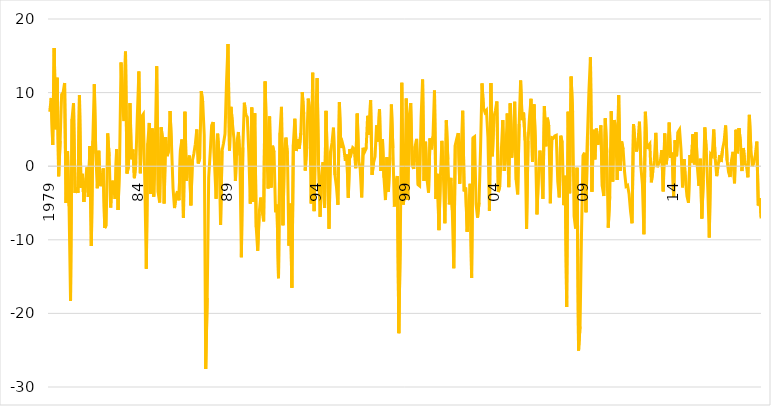
| Category | Series 0 | Series 1 | Series 2 | Series 3 |
|---|---|---|---|---|
| 1979 |  |  |  | 7.401 |
|  |  |  |  | 9.275 |
|  |  |  |  | 2.882 |
|  |  |  |  | 16.055 |
|  |  |  |  | 5.03 |
|  |  |  |  | 12.024 |
|  |  |  |  | -1.361 |
|  |  |  |  | 3.444 |
|  |  |  |  | 9.751 |
|  |  |  |  | 10.009 |
|  |  |  |  | 11.31 |
|  |  |  |  | -5.007 |
| 80 |  |  |  | 2.035 |
|  |  |  |  | -5.426 |
|  |  |  |  | -18.271 |
|  |  |  |  | 6.415 |
|  |  |  |  | 8.553 |
|  |  |  |  | -3.624 |
|  |  |  |  | -2.843 |
|  |  |  |  | -3.618 |
|  |  |  |  | 9.651 |
|  |  |  |  | -2.931 |
|  |  |  |  | -1.039 |
|  |  |  |  | -4.858 |
| 81 |  |  |  | -2.235 |
|  |  |  |  | -0.163 |
|  |  |  |  | -4.185 |
|  |  |  |  | 2.75 |
|  |  |  |  | -10.845 |
|  |  |  |  | 3.461 |
|  |  |  |  | 11.135 |
|  |  |  |  | 1.698 |
|  |  |  |  | -2.993 |
|  |  |  |  | 2.094 |
|  |  |  |  | -2.707 |
|  |  |  |  | -1.941 |
| 82 |  |  |  | -0.296 |
|  |  |  |  | -8.4 |
|  |  |  |  | -8.01 |
|  |  |  |  | 4.452 |
|  |  |  |  | 1.356 |
|  |  |  |  | -5.62 |
|  |  |  |  | -1.97 |
|  |  |  |  | -2.866 |
|  |  |  |  | -4.447 |
|  |  |  |  | 2.281 |
|  |  |  |  | -5.944 |
|  |  |  |  | 0.392 |
| 83 |  |  |  | 14.094 |
|  |  |  |  | 8.149 |
|  |  |  |  | 6.135 |
|  |  |  |  | 15.569 |
|  |  |  |  | -0.988 |
|  |  |  |  | -0.08 |
|  |  |  |  | 8.57 |
|  |  |  |  | 0.946 |
|  |  |  |  | 2.262 |
|  |  |  |  | -1.625 |
|  |  |  |  | 0.609 |
|  |  |  |  | 7.045 |
| 84 |  |  |  | 12.861 |
|  |  |  |  | -0.962 |
|  |  |  |  | 6.788 |
|  |  |  |  | 7.078 |
|  |  |  |  | -2.181 |
|  |  |  |  | -13.929 |
|  |  |  |  | 3.132 |
|  |  |  |  | 5.882 |
|  |  |  |  | -3.789 |
|  |  |  |  | 5.116 |
|  |  |  |  | -4.134 |
|  |  |  |  | 2.238 |
| 85 |  |  |  | 13.593 |
|  |  |  |  | -3.578 |
|  |  |  |  | -4.921 |
|  |  |  |  | 5.283 |
|  |  |  |  | 3.603 |
|  |  |  |  | -5.073 |
|  |  |  |  | 3.952 |
|  |  |  |  | 1.368 |
|  |  |  |  | 2.074 |
|  |  |  |  | 7.507 |
|  |  |  |  | 2.786 |
|  |  |  |  | -2.994 |
| 86 |  |  |  | -5.684 |
|  |  |  |  | -3.966 |
|  |  |  |  | -3.404 |
|  |  |  |  | -4.629 |
|  |  |  |  | 2.242 |
|  |  |  |  | 3.621 |
|  |  |  |  | -7.017 |
|  |  |  |  | 7.397 |
|  |  |  |  | -1.993 |
|  |  |  |  | 0.742 |
|  |  |  |  | 1.45 |
|  |  |  |  | -5.327 |
| 87 |  |  |  | 0.75 |
|  |  |  |  | 1.678 |
|  |  |  |  | 2.993 |
|  |  |  |  | 4.988 |
|  |  |  |  | 0.372 |
|  |  |  |  | 1.11 |
|  |  |  |  | 10.201 |
|  |  |  |  | 8.688 |
|  |  |  |  | 4.24 |
|  |  |  |  | -27.561 |
|  |  |  |  | -17.905 |
|  |  |  |  | -1.566 |
| 88 |  |  |  | 1.784 |
|  |  |  |  | 5.55 |
|  |  |  |  | 6.004 |
|  |  |  |  | 0.084 |
|  |  |  |  | -4.416 |
|  |  |  |  | 4.417 |
|  |  |  |  | 1.658 |
|  |  |  |  | -7.969 |
|  |  |  |  | 2.101 |
|  |  |  |  | 3.111 |
|  |  |  |  | 4.4 |
|  |  |  |  | 11.4 |
| 89 |  |  |  | 16.609 |
|  |  |  |  | 2.142 |
|  |  |  |  | 8.063 |
|  |  |  |  | 5.774 |
|  |  |  |  | 3.743 |
|  |  |  |  | -2.018 |
|  |  |  |  | 3.244 |
|  |  |  |  | 4.645 |
|  |  |  |  | 1.474 |
|  |  |  |  | -12.369 |
|  |  |  |  | 2.534 |
|  |  |  |  | 8.626 |
| 90 |  |  |  | 6.982 |
|  |  |  |  | 6.66 |
|  |  |  |  | 1.872 |
|  |  |  |  | -5.082 |
|  |  |  |  | 7.978 |
|  |  |  |  | -4.824 |
|  |  |  |  | 7.197 |
|  |  |  |  | -8.295 |
|  |  |  |  | -11.485 |
|  |  |  |  | -6.453 |
|  |  |  |  | -4.265 |
|  |  |  |  | -6.087 |
| 91 |  |  |  | -7.495 |
|  |  |  |  | 11.514 |
|  |  |  |  | 3.031 |
|  |  |  |  | -3.022 |
|  |  |  |  | 6.747 |
|  |  |  |  | -2.904 |
|  |  |  |  | 2.776 |
|  |  |  |  | 1.904 |
|  |  |  |  | -6.265 |
|  |  |  |  | -5.223 |
|  |  |  |  | -15.211 |
|  |  |  |  | 4.551 |
| 92 |  |  |  | 8.059 |
|  |  |  |  | -8.031 |
|  |  |  |  | 2.261 |
|  |  |  |  | 3.883 |
|  |  |  |  | 1.689 |
|  |  |  |  | -10.793 |
|  |  |  |  | -5.082 |
|  |  |  |  | -16.511 |
|  |  |  |  | 2.959 |
|  |  |  |  | 6.444 |
|  |  |  |  | 2.061 |
|  |  |  |  | 3.672 |
| 93 |  |  |  | 2.374 |
|  |  |  |  | 4.478 |
|  |  |  |  | 10.072 |
|  |  |  |  | 7.098 |
|  |  |  |  | -0.593 |
|  |  |  |  | 2.588 |
|  |  |  |  | 9.179 |
|  |  |  |  | 7.651 |
|  |  |  |  | -5.056 |
|  |  |  |  | 12.694 |
|  |  |  |  | -6.104 |
|  |  |  |  | 6.507 |
| 94 |  |  |  | 11.964 |
|  |  |  |  | -0.325 |
|  |  |  |  | -6.869 |
|  |  |  |  | -1.241 |
|  |  |  |  | 0.552 |
|  |  |  |  | -5.689 |
|  |  |  |  | 7.519 |
|  |  |  |  | -0.741 |
|  |  |  |  | -8.488 |
|  |  |  |  | 1.931 |
|  |  |  |  | 3.158 |
|  |  |  |  | 5.228 |
| 95 |  |  |  | -1.189 |
|  |  |  |  | -2.756 |
|  |  |  |  | -5.247 |
|  |  |  |  | 8.685 |
|  |  |  |  | 2.488 |
|  |  |  |  | 3.199 |
|  |  |  |  | 2.433 |
|  |  |  |  | 0.717 |
|  |  |  |  | 1.592 |
|  |  |  |  | -4.288 |
|  |  |  |  | 2.322 |
|  |  |  |  | 1.731 |
| 96 |  |  |  | 2.524 |
|  |  |  |  | 2.326 |
|  |  |  |  | -0.27 |
|  |  |  |  | 7.149 |
|  |  |  |  | 0.74 |
|  |  |  |  | -0.333 |
|  |  |  |  | -4.239 |
|  |  |  |  | 2.494 |
|  |  |  |  | 1.962 |
|  |  |  |  | 2.395 |
|  |  |  |  | 6.843 |
|  |  |  |  | 4.27 |
| 97 |  |  |  | 8.978 |
|  |  |  |  | -1.174 |
|  |  |  |  | 0.478 |
|  |  |  |  | 1.307 |
|  |  |  |  | 5.551 |
|  |  |  |  | 3.348 |
|  |  |  |  | 7.754 |
|  |  |  |  | -0.64 |
|  |  |  |  | 3.686 |
|  |  |  |  | -1.554 |
|  |  |  |  | -4.596 |
|  |  |  |  | 1.222 |
| 98 |  |  |  | -3.457 |
|  |  |  |  | 1.199 |
|  |  |  |  | 8.39 |
|  |  |  |  | 2.46 |
|  |  |  |  | -5.472 |
|  |  |  |  | -2.11 |
|  |  |  |  | -1.339 |
|  |  |  |  | -22.682 |
|  |  |  |  | -10.047 |
|  |  |  |  | 11.341 |
|  |  |  |  | -5.202 |
|  |  |  |  | -3.447 |
| 99 |  |  |  | 9.201 |
|  |  |  |  | -4.604 |
|  |  |  |  | 6.787 |
|  |  |  |  | 8.573 |
|  |  |  |  | 0.09 |
|  |  |  |  | -0.37 |
|  |  |  |  | 2.73 |
|  |  |  |  | 3.708 |
|  |  |  |  | -2.509 |
|  |  |  |  | -2.672 |
|  |  |  |  | 6.541 |
|  |  |  |  | 11.774 |
| 2000 |  |  |  | -2.011 |
|  |  |  |  | 3.324 |
|  |  |  |  | -1.809 |
|  |  |  |  | -3.592 |
|  |  |  |  | 3.773 |
|  |  |  |  | 2.295 |
|  |  |  |  | 4.063 |
|  |  |  |  | 10.277 |
|  |  |  |  | -4.45 |
|  |  |  |  | -1.038 |
|  |  |  |  | -8.684 |
|  |  |  |  | -1.424 |
| 01 |  |  |  | 3.44 |
|  |  |  |  | -1.249 |
|  |  |  |  | -7.743 |
|  |  |  |  | 6.23 |
|  |  |  |  | 0.897 |
|  |  |  |  | -5.187 |
|  |  |  |  | -1.587 |
|  |  |  |  | -5.962 |
|  |  |  |  | -13.863 |
|  |  |  |  | 2.841 |
|  |  |  |  | 3.742 |
|  |  |  |  | 4.497 |
| 02 |  |  |  | -2.369 |
|  |  |  |  | 2.075 |
|  |  |  |  | 7.542 |
|  |  |  |  | -3.419 |
|  |  |  |  | -2.887 |
|  |  |  |  | -8.916 |
|  |  |  |  | -6.29 |
|  |  |  |  | -2.398 |
|  |  |  |  | -15.182 |
|  |  |  |  | 3.877 |
|  |  |  |  | 4.026 |
|  |  |  |  | -5.133 |
| 03 |  |  |  | -6.996 |
|  |  |  |  | -4.96 |
|  |  |  |  | 2.197 |
|  |  |  |  | 11.245 |
|  |  |  |  | 7.934 |
|  |  |  |  | 7.325 |
|  |  |  |  | 7.592 |
|  |  |  |  | 3.917 |
|  |  |  |  | -6.097 |
|  |  |  |  | 11.289 |
|  |  |  |  | 1.343 |
|  |  |  |  | 6.675 |
| 04 |  |  |  | 7.531 |
|  |  |  |  | 8.795 |
|  |  |  |  | -3.514 |
|  |  |  |  | -2.707 |
|  |  |  |  | 2.069 |
|  |  |  |  | 6.261 |
|  |  |  |  | -0.644 |
|  |  |  |  | 1.621 |
|  |  |  |  | 7.168 |
|  |  |  |  | -2.84 |
|  |  |  |  | 8.533 |
|  |  |  |  | 1.181 |
| 05 |  |  |  | 3.483 |
|  |  |  |  | 8.751 |
|  |  |  |  | -1.874 |
|  |  |  |  | -3.829 |
|  |  |  |  | 5.738 |
|  |  |  |  | 11.636 |
|  |  |  |  | 6.26 |
|  |  |  |  | 7.29 |
|  |  |  |  | 3.514 |
|  |  |  |  | -8.512 |
|  |  |  |  | 3.438 |
|  |  |  |  | 6.74 |
| 06 |  |  |  | 9.155 |
|  |  |  |  | 0.602 |
|  |  |  |  | 8.399 |
|  |  |  |  | 2.958 |
|  |  |  |  | -6.546 |
|  |  |  |  | -1.198 |
|  |  |  |  | 2.11 |
|  |  |  |  | -0.191 |
|  |  |  |  | -4.438 |
|  |  |  |  | 8.165 |
|  |  |  |  | 2.707 |
|  |  |  |  | 6.587 |
| 07 |  |  |  | 5.421 |
|  |  |  |  | -5.036 |
|  |  |  |  | 3.875 |
|  |  |  |  | 3.801 |
|  |  |  |  | 4.103 |
|  |  |  |  | 4.2 |
|  |  |  |  | -2.068 |
|  |  |  |  | -4.236 |
|  |  |  |  | 4.131 |
|  |  |  |  | 3.207 |
|  |  |  |  | -5.291 |
|  |  |  |  | -1.29 |
| 08 |  |  |  | -19.135 |
|  |  |  |  | 7.392 |
|  |  |  |  | -3.664 |
|  |  |  |  | 12.178 |
|  |  |  |  | 7.307 |
|  |  |  |  | -6.779 |
|  |  |  |  | -8.46 |
|  |  |  |  | -0.219 |
|  |  |  |  | -25.042 |
|  |  |  |  | -21.78 |
|  |  |  |  | -9.046 |
|  |  |  |  | 1.451 |
| 09 |  |  |  | 1.83 |
|  |  |  |  | -6.267 |
|  |  |  |  | 4.025 |
|  |  |  |  | 10.298 |
|  |  |  |  | 14.791 |
|  |  |  |  | -3.46 |
|  |  |  |  | 4.942 |
|  |  |  |  | 0.93 |
|  |  |  |  | 5.112 |
|  |  |  |  | 2.91 |
|  |  |  |  | 3.839 |
|  |  |  |  | 5.545 |
| 10 |  |  |  | -2.766 |
|  |  |  |  | -4.055 |
|  |  |  |  | 6.507 |
|  |  |  |  | 1.867 |
|  |  |  |  | -8.347 |
|  |  |  |  | -4.104 |
|  |  |  |  | 7.474 |
|  |  |  |  | -2.086 |
|  |  |  |  | 6.264 |
|  |  |  |  | 5.289 |
|  |  |  |  | -1.867 |
|  |  |  |  | 9.645 |
| 11 |  |  |  | -0.619 |
|  |  |  |  | 3.368 |
|  |  |  |  | 2.294 |
|  |  |  |  | -0.825 |
|  |  |  |  | -2.74 |
|  |  |  |  | -2.592 |
|  |  |  |  | -3.772 |
|  |  |  |  | -6.147 |
|  |  |  |  | -7.752 |
|  |  |  |  | 5.732 |
|  |  |  |  | 3.195 |
|  |  |  |  | 1.992 |
| 12 |  |  |  | 3.265 |
|  |  |  |  | 6.05 |
|  |  |  |  | -0.168 |
|  |  |  |  | -2.509 |
|  |  |  |  | -9.255 |
|  |  |  |  | 7.386 |
|  |  |  |  | 2.37 |
|  |  |  |  | 2.757 |
|  |  |  |  | 3.033 |
|  |  |  |  | -2.193 |
|  |  |  |  | -0.67 |
|  |  |  |  | 0.824 |
| 13 |  |  |  | 4.521 |
|  |  |  |  | -0.133 |
|  |  |  |  | 0.485 |
|  |  |  |  | 0.6 |
|  |  |  |  | 2.182 |
|  |  |  |  | -3.422 |
|  |  |  |  | 4.441 |
|  |  |  |  | 0.268 |
|  |  |  |  | 1.87 |
|  |  |  |  | 5.929 |
|  |  |  |  | 1.131 |
|  |  |  |  | 1.845 |
| 14 |  |  |  | -4.108 |
|  |  |  |  | 3.535 |
|  |  |  |  | 1.349 |
|  |  |  |  | 4.645 |
|  |  |  |  | 4.98 |
|  |  |  |  | 2.189 |
|  |  |  |  | -2.879 |
|  |  |  |  | 0.964 |
|  |  |  |  | -1.87 |
|  |  |  |  | -4.09 |
|  |  |  |  | -4.963 |
|  |  |  |  | 1.515 |
| 15 |  |  |  | 0.496 |
|  |  |  |  | 4.337 |
|  |  |  |  | 0.253 |
|  |  |  |  | 4.611 |
|  |  |  |  | -0.132 |
|  |  |  |  | -2.663 |
|  |  |  |  | 1.012 |
|  |  |  |  | -7.109 |
|  |  |  |  | -1.853 |
|  |  |  |  | 5.269 |
|  |  |  |  | 2.156 |
|  |  |  |  | -3.091 |
| 16 |  |  |  | -9.683 |
|  |  |  |  | 1.628 |
|  |  |  |  | 1.402 |
|  |  |  |  | 4.986 |
|  |  |  |  | 1.091 |
|  |  |  |  | -1.354 |
|  |  |  |  | 0.169 |
|  |  |  |  | 1.512 |
|  |  |  |  | 0.567 |
|  |  |  |  | 2.371 |
|  |  |  |  | 3.376 |
|  |  |  |  | 5.529 |
| 17 |  |  |  | 0.777 |
|  |  |  |  | -0.809 |
|  |  |  |  | -1.473 |
|  |  |  |  | 0.825 |
|  |  |  |  | 1.952 |
|  |  |  |  | -2.316 |
|  |  |  |  | 4.943 |
|  |  |  |  | 1.745 |
|  |  |  |  | 5.184 |
|  |  |  |  | 3.222 |
|  |  |  |  | -0.659 |
|  |  |  |  | 2.476 |
| 2018 |  |  |  | 0.322 |